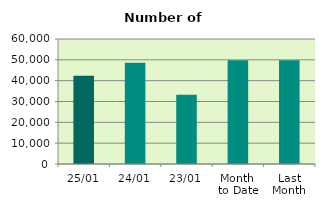
| Category | Series 0 |
|---|---|
| 25/01 | 42336 |
| 24/01 | 48658 |
| 23/01 | 33242 |
| Month 
to Date | 49747.529 |
| Last
Month | 49764 |